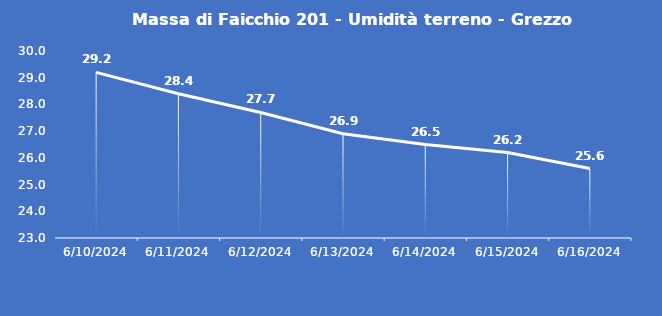
| Category | Massa di Faicchio 201 - Umidità terreno - Grezzo (%VWC) |
|---|---|
| 6/10/24 | 29.2 |
| 6/11/24 | 28.4 |
| 6/12/24 | 27.7 |
| 6/13/24 | 26.9 |
| 6/14/24 | 26.5 |
| 6/15/24 | 26.2 |
| 6/16/24 | 25.6 |